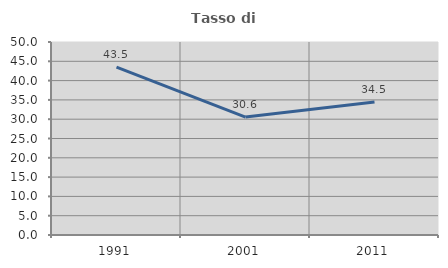
| Category | Tasso di occupazione   |
|---|---|
| 1991.0 | 43.499 |
| 2001.0 | 30.556 |
| 2011.0 | 34.459 |